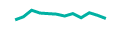
| Category | Series 0 |
|---|---|
| 0 | 35691 |
| 1 | 50852 |
| 2 | 83939 |
| 3 | 69742 |
| 4 | 66906 |
| 5 | 64280 |
| 6 | 54815 |
| 7 | 66936 |
| 8 | 46284 |
| 9 | 71227 |
| 10 | 58215 |
| 11 | 42419 |